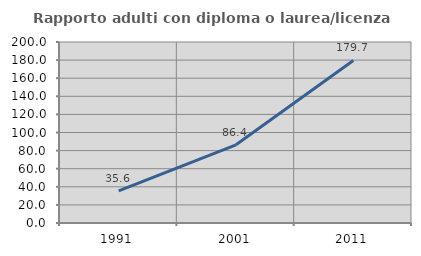
| Category | Rapporto adulti con diploma o laurea/licenza media  |
|---|---|
| 1991.0 | 35.556 |
| 2001.0 | 86.364 |
| 2011.0 | 179.651 |